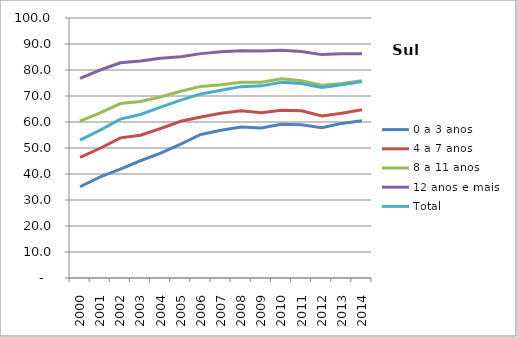
| Category | 0 a 3 anos | 4 a 7 anos | 8 a 11 anos | 12 anos e mais | Total |
|---|---|---|---|---|---|
| 2000.0 | 35.1 | 46.4 | 60.3 | 76.8 | 53 |
| 2001.0 | 38.9 | 49.9 | 63.5 | 80 | 56.9 |
| 2002.0 | 41.9 | 53.9 | 67.1 | 82.8 | 61.1 |
| 2003.0 | 45.1 | 54.9 | 67.9 | 83.5 | 62.9 |
| 2004.0 | 48 | 57.5 | 69.6 | 84.5 | 65.7 |
| 2005.0 | 51.5 | 60.3 | 71.8 | 85.1 | 68.4 |
| 2006.0 | 55.2 | 61.9 | 73.7 | 86.3 | 70.8 |
| 2007.0 | 56.8 | 63.4 | 74.3 | 87 | 72.2 |
| 2008.0 | 58.1 | 64.3 | 75.3 | 87.4 | 73.6 |
| 2009.0 | 57.7 | 63.6 | 75.3 | 87.3 | 73.9 |
| 2010.0 | 59.097 | 64.49 | 76.613 | 87.588 | 75.253 |
| 2011.0 | 58.947 | 64.329 | 75.881 | 87.109 | 74.785 |
| 2012.0 | 57.755 | 62.326 | 74.153 | 85.915 | 73.271 |
| 2013.0 | 59.459 | 63.368 | 74.843 | 86.215 | 74.349 |
| 2014.0 | 60.476 | 64.737 | 75.84 | 86.238 | 75.583 |